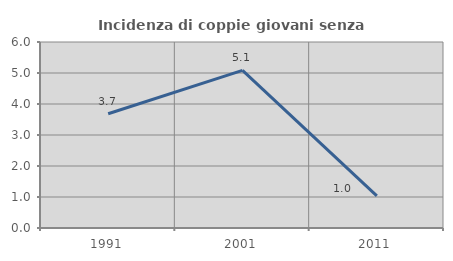
| Category | Incidenza di coppie giovani senza figli |
|---|---|
| 1991.0 | 3.684 |
| 2001.0 | 5.085 |
| 2011.0 | 1.036 |